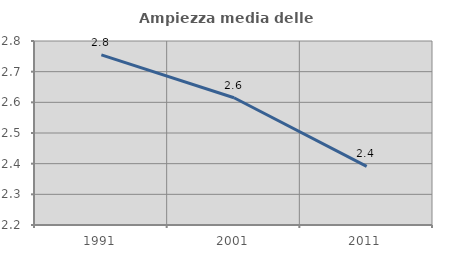
| Category | Ampiezza media delle famiglie |
|---|---|
| 1991.0 | 2.755 |
| 2001.0 | 2.615 |
| 2011.0 | 2.391 |